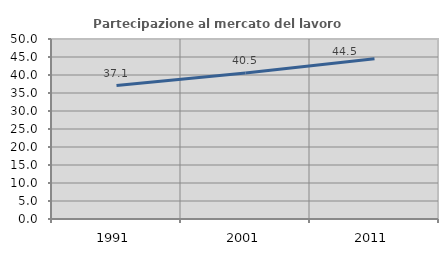
| Category | Partecipazione al mercato del lavoro  femminile |
|---|---|
| 1991.0 | 37.083 |
| 2001.0 | 40.535 |
| 2011.0 | 44.539 |